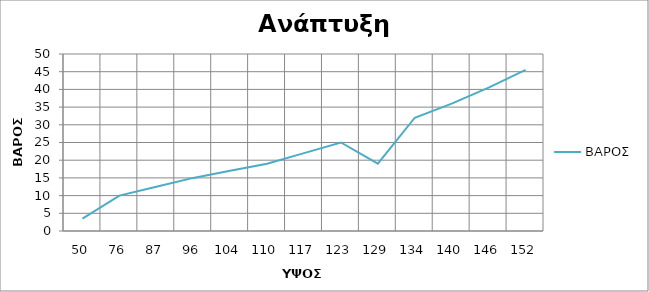
| Category | ΒΑΡΟΣ |
|---|---|
| 50.0 | 3.5 |
| 76.0 | 10 |
| 87.0 | 12.5 |
| 96.0 | 15 |
| 104.0 | 17 |
| 110.0 | 19 |
| 117.0 | 22 |
| 123.0 | 25 |
| 129.0 | 19 |
| 134.0 | 32 |
| 140.0 | 36 |
| 146.0 | 40.5 |
| 152.0 | 45.5 |